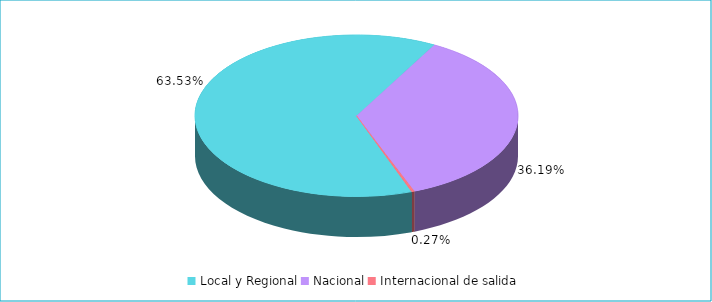
| Category | Series 1 | Series 0 |
|---|---|---|
| Local y Regional | 0.635 | 0.635 |
| Nacional | 0.362 | 0.362 |
| Internacional de salida | 0.003 | 0.003 |